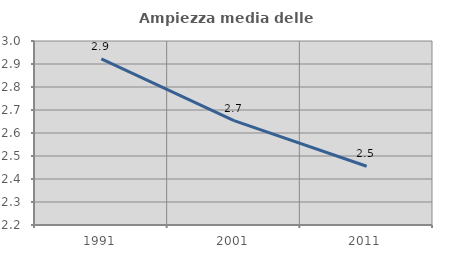
| Category | Ampiezza media delle famiglie |
|---|---|
| 1991.0 | 2.922 |
| 2001.0 | 2.654 |
| 2011.0 | 2.455 |